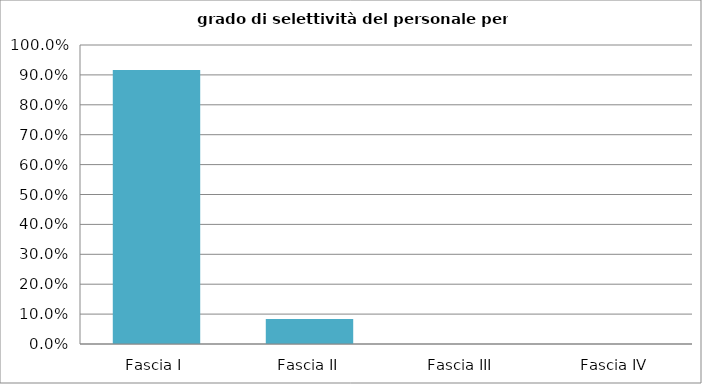
| Category | Totale ente |
|---|---|
| Fascia I | 0.917 |
| Fascia II | 0.083 |
| Fascia III | 0 |
| Fascia IV | 0 |